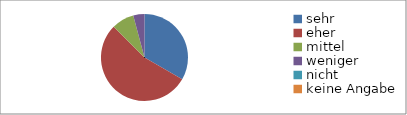
| Category | Series 0 |
|---|---|
| sehr | 8 |
| eher | 13 |
| mittel | 2 |
| weniger | 1 |
| nicht | 0 |
| keine Angabe | 0 |